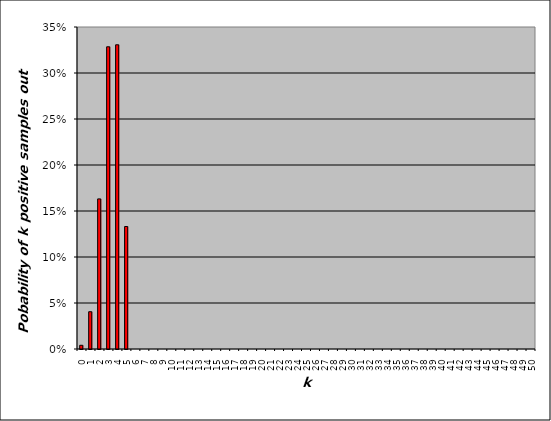
| Category | k |
|---|---|
| 0.0 | 0.004 |
| 1.0 | 0.041 |
| 2.0 | 0.163 |
| 3.0 | 0.328 |
| 4.0 | 0.331 |
| 5.0 | 0.133 |
| 6.0 | 0 |
| 7.0 | 0 |
| 8.0 | 0 |
| 9.0 | 0 |
| 10.0 | 0 |
| 11.0 | 0 |
| 12.0 | 0 |
| 13.0 | 0 |
| 14.0 | 0 |
| 15.0 | 0 |
| 16.0 | 0 |
| 17.0 | 0 |
| 18.0 | 0 |
| 19.0 | 0 |
| 20.0 | 0 |
| 21.0 | 0 |
| 22.0 | 0 |
| 23.0 | 0 |
| 24.0 | 0 |
| 25.0 | 0 |
| 26.0 | 0 |
| 27.0 | 0 |
| 28.0 | 0 |
| 29.0 | 0 |
| 30.0 | 0 |
| 31.0 | 0 |
| 32.0 | 0 |
| 33.0 | 0 |
| 34.0 | 0 |
| 35.0 | 0 |
| 36.0 | 0 |
| 37.0 | 0 |
| 38.0 | 0 |
| 39.0 | 0 |
| 40.0 | 0 |
| 41.0 | 0 |
| 42.0 | 0 |
| 43.0 | 0 |
| 44.0 | 0 |
| 45.0 | 0 |
| 46.0 | 0 |
| 47.0 | 0 |
| 48.0 | 0 |
| 49.0 | 0 |
| 50.0 | 0 |